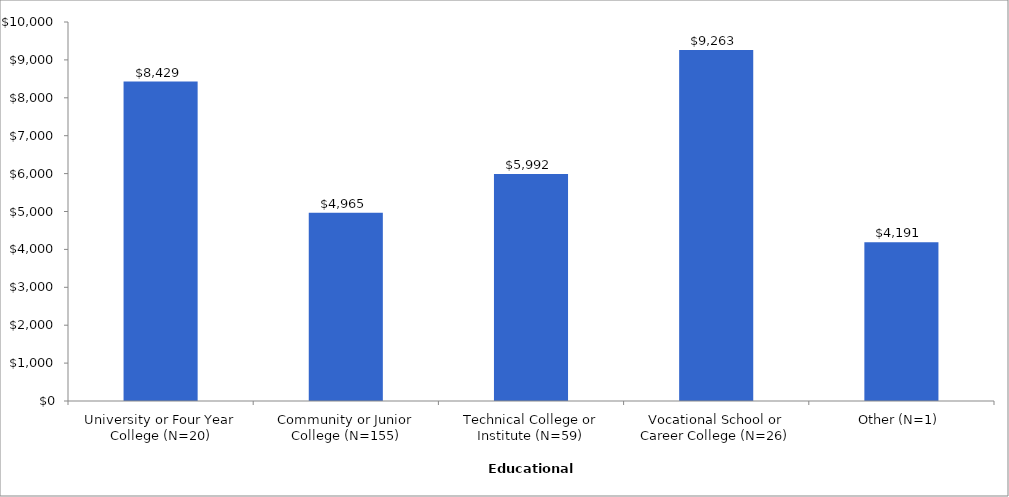
| Category | Series 0 |
|---|---|
| University or Four Year College (N=20) | 8429 |
| Community or Junior College (N=155) | 4965 |
| Technical College or Institute (N=59) | 5992 |
| Vocational School or Career College (N=26) | 9263 |
| Other (N=1) | 4191 |